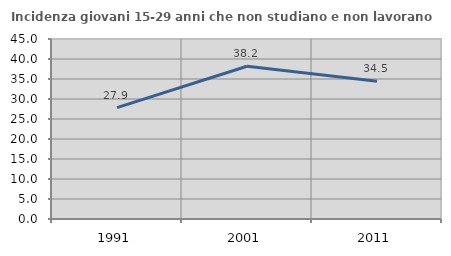
| Category | Incidenza giovani 15-29 anni che non studiano e non lavorano  |
|---|---|
| 1991.0 | 27.861 |
| 2001.0 | 38.182 |
| 2011.0 | 34.457 |